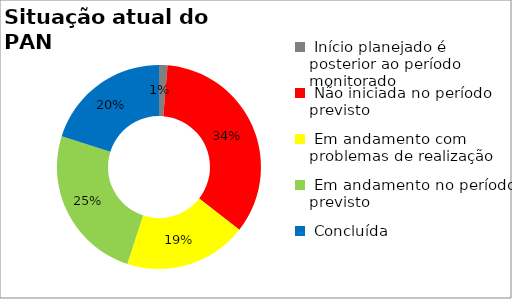
| Category | Series 0 |
|---|---|
|  Início planejado é posterior ao período monitorado | 0.013 |
|  Não iniciada no período previsto | 0.342 |
|  Em andamento com problemas de realização | 0.195 |
|  Em andamento no período previsto  | 0.248 |
|  Concluída | 0.201 |